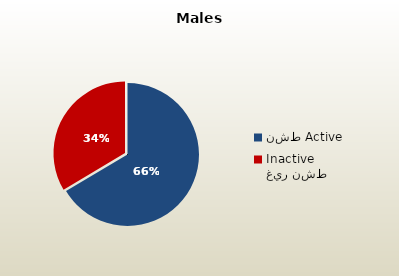
| Category | الذكور القطريين  Qatari Males |
|---|---|
| نشط Active | 70635 |
| غير نشط Inactive | 35648 |